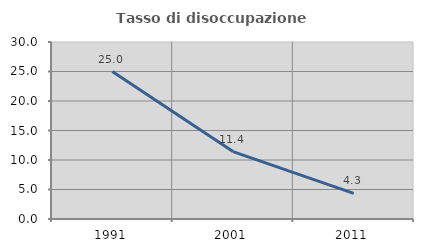
| Category | Tasso di disoccupazione giovanile  |
|---|---|
| 1991.0 | 25 |
| 2001.0 | 11.429 |
| 2011.0 | 4.348 |